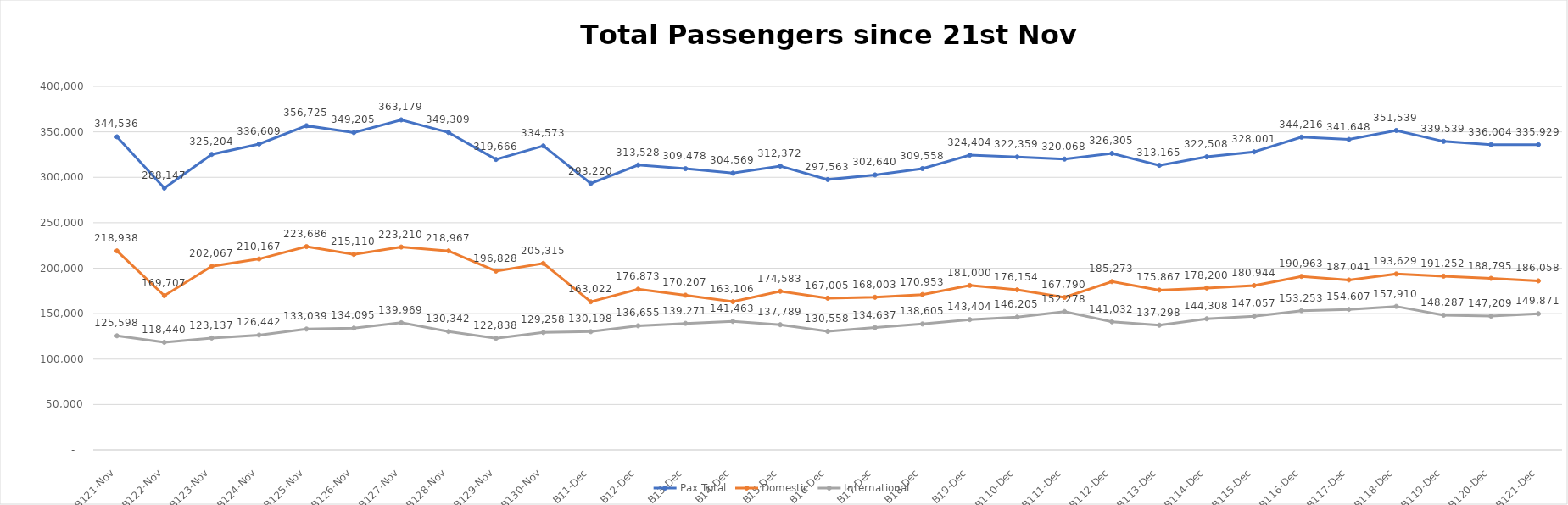
| Category | Pax Total |  Domestic  |  International  |
|---|---|---|---|
| 2022-11-21 | 344536 | 218938 | 125598 |
| 2022-11-22 | 288147 | 169707 | 118440 |
| 2022-11-23 | 325204 | 202067 | 123137 |
| 2022-11-24 | 336609 | 210167 | 126442 |
| 2022-11-25 | 356725 | 223686 | 133039 |
| 2022-11-26 | 349205 | 215110 | 134095 |
| 2022-11-27 | 363179 | 223210 | 139969 |
| 2022-11-28 | 349309 | 218967 | 130342 |
| 2022-11-29 | 319666 | 196828 | 122838 |
| 2022-11-30 | 334573 | 205315 | 129258 |
| 2022-12-01 | 293220 | 163022 | 130198 |
| 2022-12-02 | 313528 | 176873 | 136655 |
| 2022-12-03 | 309478 | 170207 | 139271 |
| 2022-12-04 | 304569 | 163106 | 141463 |
| 2022-12-05 | 312372 | 174583 | 137789 |
| 2022-12-06 | 297563 | 167005 | 130558 |
| 2022-12-07 | 302640 | 168003 | 134637 |
| 2022-12-08 | 309558 | 170953 | 138605 |
| 2022-12-09 | 324404 | 181000 | 143404 |
| 2022-12-10 | 322359 | 176154 | 146205 |
| 2022-12-11 | 320068 | 167790 | 152278 |
| 2022-12-12 | 326305 | 185273 | 141032 |
| 2022-12-13 | 313165 | 175867 | 137298 |
| 2022-12-14 | 322508 | 178200 | 144308 |
| 2022-12-15 | 328001 | 180944 | 147057 |
| 2022-12-16 | 344216 | 190963 | 153253 |
| 2022-12-17 | 341648 | 187041 | 154607 |
| 2022-12-18 | 351539 | 193629 | 157910 |
| 2022-12-19 | 339539 | 191252 | 148287 |
| 2022-12-20 | 336004 | 188795 | 147209 |
| 2022-12-21 | 335929 | 186058 | 149871 |